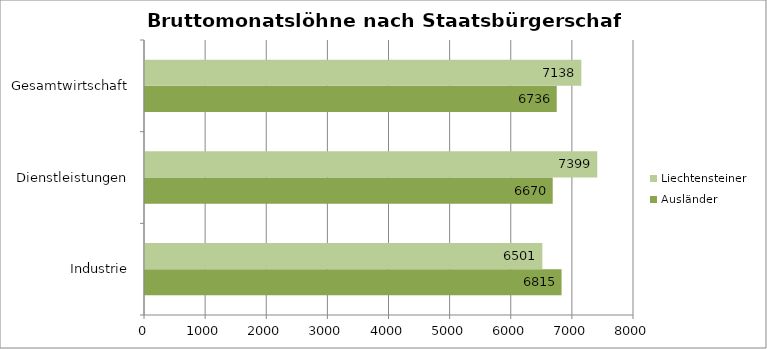
| Category | Ausländer | Liechtensteiner |
|---|---|---|
| Industrie | 6815 | 6501 |
| Dienstleistungen | 6670 | 7399 |
| Gesamtwirtschaft | 6736 | 7138 |